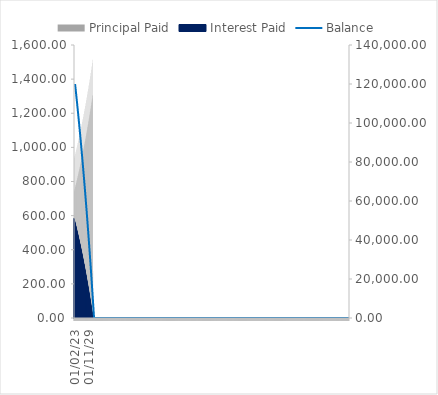
| Category | Principal Paid | Interest Paid |
|---|---|---|
| 01/02/23 | 938.582 | 584.106 |
| 01/03/23 | 743.151 | 579.537 |
| 01/04/23 | 746.768 | 575.92 |
| 01/05/23 | 950.403 | 572.285 |
| 01/06/23 | 755.029 | 567.659 |
| 01/07/23 | 758.704 | 563.984 |
| 01/08/23 | 962.397 | 560.291 |
| 01/09/23 | 767.082 | 555.606 |
| 01/10/23 | 770.816 | 551.873 |
| 01/11/23 | 974.568 | 548.121 |
| 01/12/23 | 779.311 | 543.377 |
| 01/01/24 | 783.105 | 539.583 |
| 01/02/24 | 986.917 | 535.772 |
| 01/03/24 | 791.72 | 530.968 |
| 01/04/24 | 795.574 | 527.114 |
| 01/05/24 | 999.447 | 523.242 |
| 01/06/24 | 804.312 | 518.377 |
| 01/07/24 | 808.227 | 514.462 |
| 01/08/24 | 1012.161 | 510.528 |
| 01/09/24 | 817.087 | 505.601 |
| 01/10/24 | 821.065 | 501.624 |
| 01/11/24 | 1025.061 | 497.627 |
| 01/12/24 | 830.051 | 492.638 |
| 01/01/25 | 834.091 | 488.597 |
| 01/02/25 | 1038.151 | 484.537 |
| 01/03/25 | 843.204 | 479.484 |
| 01/04/25 | 847.309 | 475.38 |
| 01/05/25 | 1051.433 | 471.255 |
| 01/06/25 | 856.551 | 466.137 |
| 01/07/25 | 860.72 | 461.968 |
| 01/08/25 | 1064.91 | 457.779 |
| 01/09/25 | 870.093 | 452.595 |
| 01/10/25 | 874.328 | 448.36 |
| 01/11/25 | 1078.584 | 444.104 |
| 01/12/25 | 883.834 | 438.854 |
| 01/01/26 | 888.137 | 434.552 |
| 01/02/26 | 1092.46 | 430.229 |
| 01/03/26 | 897.777 | 424.911 |
| 01/04/26 | 902.147 | 420.541 |
| 01/05/26 | 1106.538 | 416.15 |
| 01/06/26 | 911.925 | 410.764 |
| 01/07/26 | 916.363 | 406.325 |
| 01/08/26 | 1120.824 | 401.865 |
| 01/09/26 | 926.279 | 396.409 |
| 01/10/26 | 930.788 | 391.9 |
| 01/11/26 | 1135.319 | 387.369 |
| 01/12/26 | 940.845 | 381.843 |
| 01/01/27 | 945.425 | 377.264 |
| 01/02/27 | 1150.027 | 372.662 |
| 01/03/27 | 955.624 | 367.064 |
| 01/04/27 | 960.276 | 362.412 |
| 01/05/27 | 1164.95 | 357.738 |
| 01/06/27 | 970.621 | 352.068 |
| 01/07/27 | 975.345 | 347.343 |
| 01/08/27 | 1180.093 | 342.596 |
| 01/09/27 | 985.837 | 336.851 |
| 01/10/27 | 990.635 | 332.053 |
| 01/11/27 | 1195.457 | 327.231 |
| 01/12/27 | 1001.276 | 321.412 |
| 01/01/28 | 1006.15 | 316.538 |
| 01/02/28 | 1211.048 | 311.641 |
| 01/03/28 | 1016.942 | 305.746 |
| 01/04/28 | 1021.892 | 300.796 |
| 01/05/28 | 1226.867 | 295.822 |
| 01/06/28 | 1032.838 | 289.85 |
| 01/07/28 | 1037.866 | 284.823 |
| 01/08/28 | 1242.918 | 279.771 |
| 01/09/28 | 1048.968 | 273.721 |
| 01/10/28 | 1054.074 | 268.615 |
| 01/11/28 | 1259.204 | 263.484 |
| 01/12/28 | 1065.334 | 257.355 |
| 01/01/29 | 1070.519 | 252.169 |
| 01/02/29 | 1275.73 | 246.958 |
| 01/03/29 | 1081.94 | 240.749 |
| 01/04/29 | 1087.206 | 235.482 |
| 01/05/29 | 1292.498 | 230.19 |
| 01/06/29 | 1098.789 | 223.899 |
| 01/07/29 | 1104.138 | 218.551 |
| 01/08/29 | 1309.512 | 213.176 |
| 01/09/29 | 1115.886 | 206.802 |
| 01/10/29 | 1121.318 | 201.37 |
| 01/11/29 | 1326.776 | 195.912 |
| 01/12/29 | 1133.234 | 189.454 |
| 01/01/30 | 1138.75 | 183.938 |
| 01/02/30 | 1344.293 | 178.395 |
| 01/03/30 | 1150.837 | 171.852 |
| 01/04/30 | 1156.438 | 166.25 |
| 01/05/30 | 1362.067 | 160.621 |
| 01/06/30 | 1168.697 | 153.991 |
| 01/07/30 | 1174.386 | 148.302 |
| 01/08/30 | 1380.102 | 142.586 |
| 01/09/30 | 1186.82 | 135.868 |
| 01/10/30 | 1192.597 | 130.091 |
| 01/11/30 | 1398.402 | 124.286 |
| 01/12/30 | 1205.209 | 117.48 |
| 01/01/31 | 1211.075 | 111.613 |
| 01/02/31 | 1416.97 | 105.718 |
| 01/03/31 | 1223.867 | 98.821 |
| 01/04/31 | 1229.825 | 92.864 |
| 01/05/31 | 1435.811 | 86.878 |
| 01/06/31 | 1242.8 | 79.889 |
| 01/07/31 | 1248.849 | 73.839 |
| 01/08/31 | 1454.928 | 67.76 |
| 01/09/31 | 1262.01 | 60.678 |
| 01/10/31 | 1268.153 | 54.536 |
| 01/11/31 | 1474.326 | 48.363 |
| 01/12/31 | 1281.502 | 41.186 |
| 01/01/32 | 1287.74 | 34.949 |
| 01/02/32 | 1494.008 | 28.681 |
| 01/03/32 | 1301.28 | 21.408 |
| 01/04/32 | 1307.614 | 15.074 |
| 01/05/32 | 1513.979 | 8.709 |
| 01/06/32 | 275.305 | 1.34 |